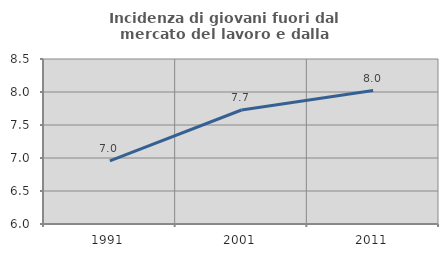
| Category | Incidenza di giovani fuori dal mercato del lavoro e dalla formazione  |
|---|---|
| 1991.0 | 6.957 |
| 2001.0 | 7.727 |
| 2011.0 | 8.021 |